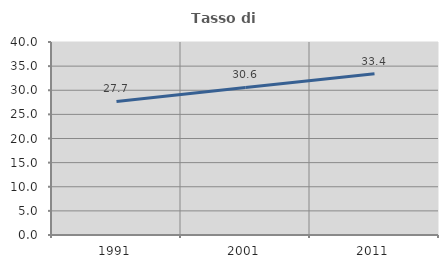
| Category | Tasso di occupazione   |
|---|---|
| 1991.0 | 27.682 |
| 2001.0 | 30.584 |
| 2011.0 | 33.419 |